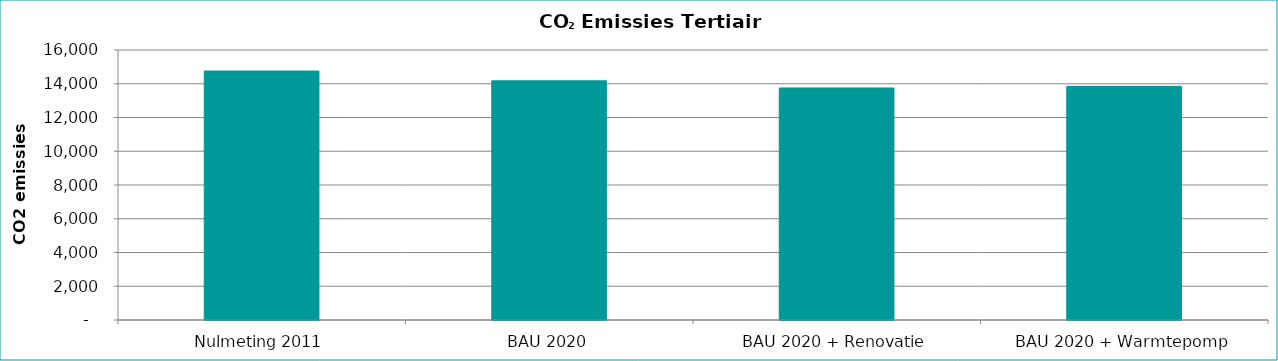
| Category | Emissies CO2 in 2020 [ton] volgens … |
|---|---|
| Nulmeting 2011 | 14753.427 |
| BAU 2020 | 14173.743 |
| BAU 2020 + Renovatie | 13750.575 |
| BAU 2020 + Warmtepomp | 13847.034 |